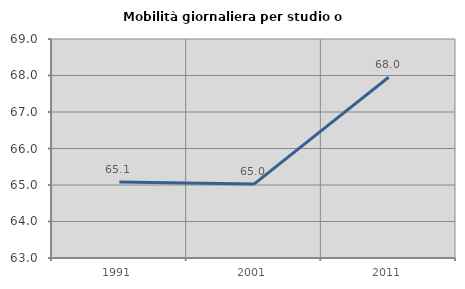
| Category | Mobilità giornaliera per studio o lavoro |
|---|---|
| 1991.0 | 65.085 |
| 2001.0 | 65.024 |
| 2011.0 | 67.953 |